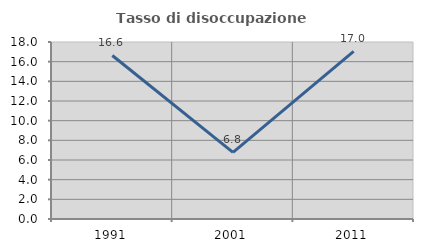
| Category | Tasso di disoccupazione giovanile  |
|---|---|
| 1991.0 | 16.628 |
| 2001.0 | 6.78 |
| 2011.0 | 17.037 |